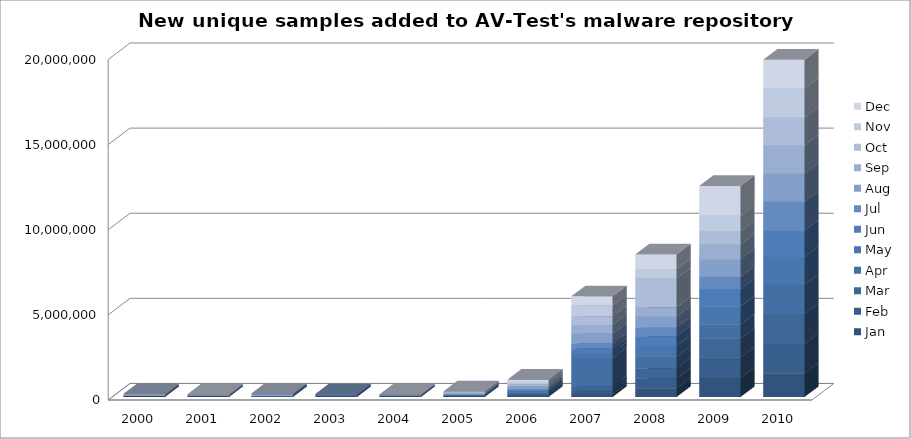
| Category | Jan | Feb | Mar | Apr | May | Jun | Jul | Aug | Sep | Oct | Nov | Dec |
|---|---|---|---|---|---|---|---|---|---|---|---|---|
| 2000.0 | 13071 | 5280 | 12265 | 11863 | 2857 | 4889 | 21112 | 5481 | 80400 | 9594 | 3993 | 5507 |
| 2001.0 | 6694 | 14476 | 7036 | 11700 | 10371 | 5764 | 8062 | 16578 | 10789 | 34571 | 23175 | 6345 |
| 2002.0 | 6639 | 5391 | 9559 | 6153 | 7671 | 11909 | 6153 | 109834 | 16537 | 9686 | 6146 | 3380 |
| 2003.0 | 4921 | 9425 | 19351 | 24779 | 24145 | 25845 | 26270 | 7213 | 13338 | 6317 | 7429 | 9748 |
| 2004.0 | 8419 | 7086 | 12935 | 9912 | 10313 | 13734 | 11433 | 26691 | 7933 | 10819 | 9867 | 13260 |
| 2005.0 | 14059 | 14520 | 20491 | 20472 | 23996 | 22634 | 26303 | 30949 | 28498 | 37413 | 45873 | 48599 |
| 2006.0 | 55521 | 51452 | 50765 | 84803 | 69615 | 65887 | 91083 | 84997 | 87596 | 110072 | 131087 | 140019 |
| 2007.0 | 177615 | 194864 | 251434 | 1680631 | 290333 | 255045 | 292326 | 569838 | 527610 | 511153 | 638560 | 528090 |
| 2008.0 | 523496 | 580657 | 595260 | 677689 | 627738 | 569052 | 494452 | 656722 | 544217 | 1703594 | 554564 | 851491 |
| 2009.0 | 1118143 | 1207723 | 1128012 | 817248 | 1070530 | 1003433 | 716220 | 1033857 | 872861 | 758368 | 919858 | 1750581 |
| 2010.0 | 1394649 | 1743360 | 1761740 | 1703059 | 1627090 | 1561570 | 1678434 | 1654758 | 1661375 | 1619500 | 1723810 | 1684887 |